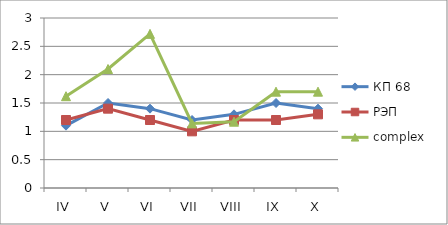
| Category | КП 68 | РЭП  | complex |
|---|---|---|---|
| IV | 1.1 | 1.2 | 1.62 |
| V | 1.5 | 1.4 | 2.1 |
| VI | 1.4 | 1.2 | 2.72 |
| VII | 1.2 | 1 | 1.14 |
| VIII | 1.3 | 1.2 | 1.17 |
| IX | 1.5 | 1.2 | 1.7 |
| X | 1.4 | 1.3 | 1.7 |